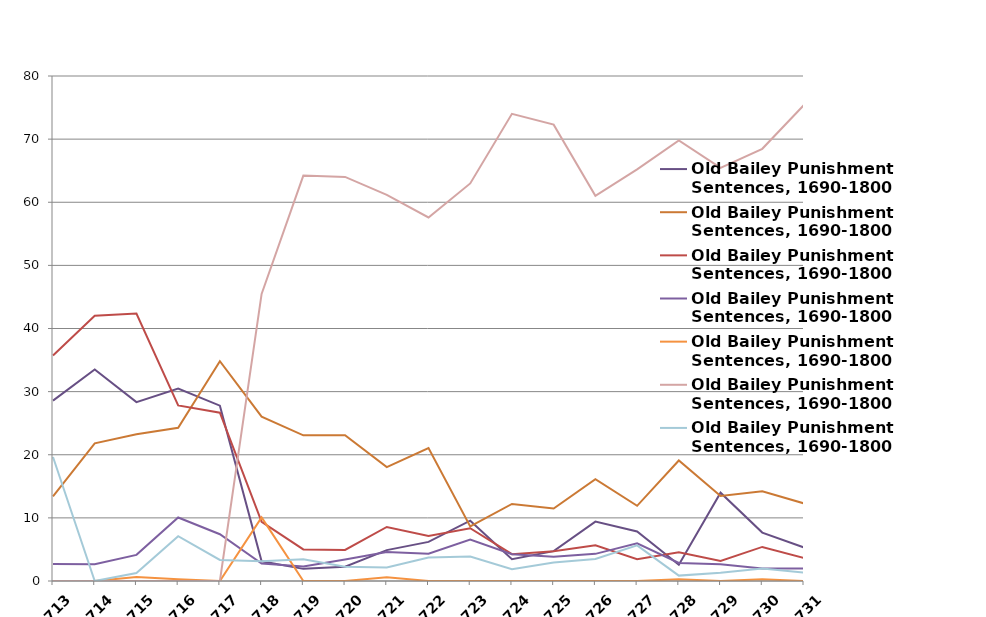
| Category | Old Bailey Punishment Sentences, 1690-1800 |
|---|---|
| 1713 | 19.643 |
| 1714 | 0 |
| 1715 | 1.274 |
| 1716 | 7.101 |
| 1717 | 3.333 |
| 1718 | 3.125 |
| 1719 | 3.462 |
| 1720 | 2.273 |
| 1721 | 2.141 |
| 1722 | 3.715 |
| 1723 | 3.881 |
| 1724 | 1.857 |
| 1725 | 2.928 |
| 1726 | 3.495 |
| 1727 | 5.643 |
| 1728 | 0.855 |
| 1729 | 1.319 |
| 1730 | 1.989 |
| 1731 | 1.329 |